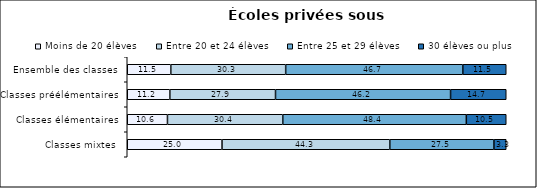
| Category | Moins de 20 élèves | Entre 20 et 24 élèves | Entre 25 et 29 élèves | 30 élèves ou plus |
|---|---|---|---|---|
| Classes mixtes | 25 | 44.28 | 27.47 | 3.25 |
| Classes élémentaires | 10.61 | 30.43 | 48.43 | 10.53 |
| Classes préélémentaires | 11.24 | 27.88 | 46.19 | 14.69 |
| Ensemble des classes | 11.49 | 30.31 | 46.74 | 11.46 |